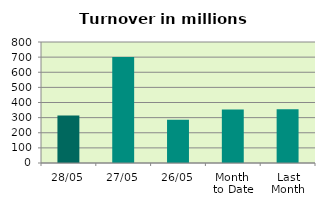
| Category | Series 0 |
|---|---|
| 28/05 | 314.732 |
| 27/05 | 700.928 |
| 26/05 | 285.135 |
| Month 
to Date | 354.009 |
| Last
Month | 356.105 |